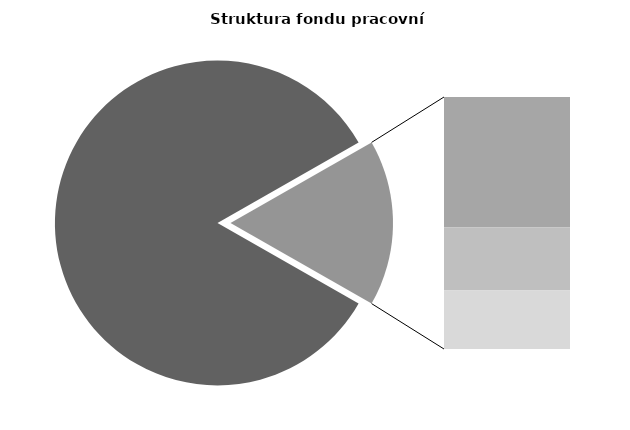
| Category | Series 0 |
|---|---|
| Průměrná měsíční odpracovaná doba bez přesčasu | 140.729 |
| Dovolená | 14.405 |
| Nemoc | 6.984 |
| Jiné | 6.466 |